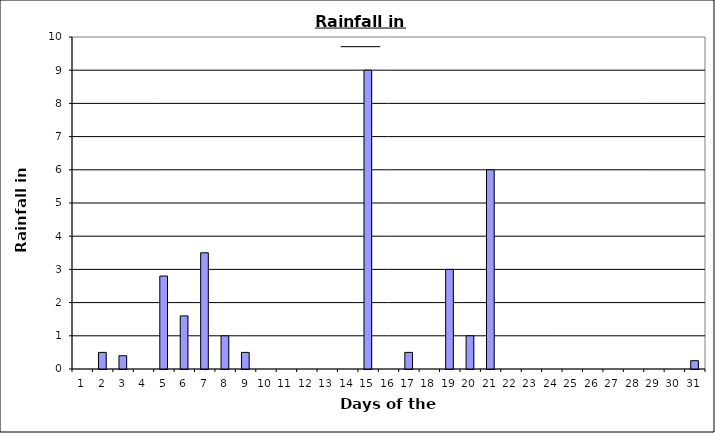
| Category | Series 0 |
|---|---|
| 0 | 0 |
| 1 | 0.5 |
| 2 | 0.4 |
| 3 | 0 |
| 4 | 2.8 |
| 5 | 1.6 |
| 6 | 3.5 |
| 7 | 1 |
| 8 | 0.5 |
| 9 | 0 |
| 10 | 0 |
| 11 | 0 |
| 12 | 0 |
| 13 | 0 |
| 14 | 9 |
| 15 | 0 |
| 16 | 0.5 |
| 17 | 0 |
| 18 | 3 |
| 19 | 1 |
| 20 | 6 |
| 21 | 0 |
| 22 | 0 |
| 23 | 0 |
| 24 | 0 |
| 25 | 0 |
| 26 | 0 |
| 27 | 0 |
| 28 | 0 |
| 29 | 0 |
| 30 | 0.25 |